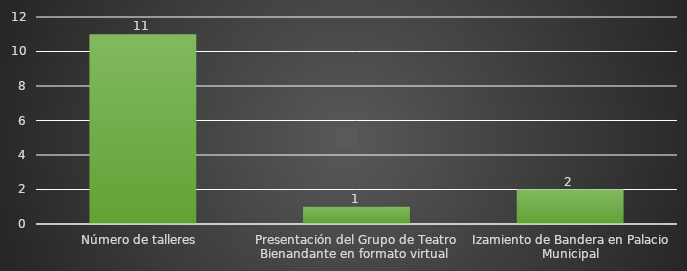
| Category | INDICADOR  |
|---|---|
| Número de talleres  | 11 |
| Presentación del Grupo de Teatro Bienandante en formato virtual  | 1 |
| Izamiento de Bandera en Palacio Municipal | 2 |